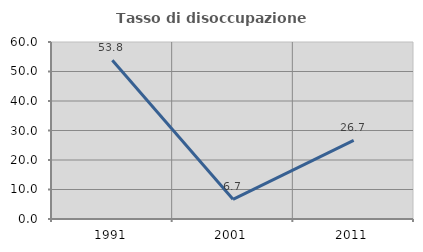
| Category | Tasso di disoccupazione giovanile  |
|---|---|
| 1991.0 | 53.846 |
| 2001.0 | 6.667 |
| 2011.0 | 26.667 |